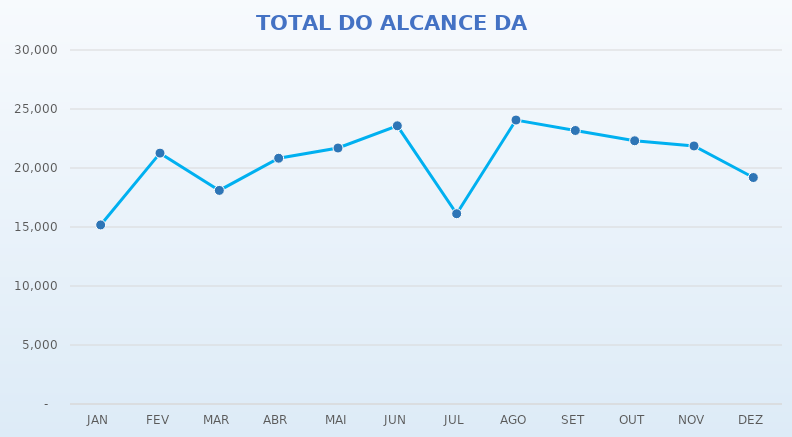
| Category | Series 0 | Series 1 |
|---|---|---|
| JAN |  | 15175 |
| FEV |  | 21262 |
| MAR |  | 18101 |
| ABR |  | 20828 |
| MAI |  | 21694 |
| JUN |  | 23577 |
| JUL |  | 16125 |
| AGO |  | 24065 |
| SET |  | 23179 |
| OUT |  | 22307 |
| NOV |  | 21867 |
| DEZ |  | 19193 |